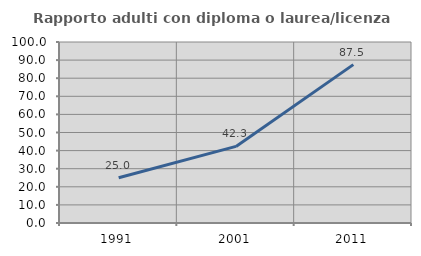
| Category | Rapporto adulti con diploma o laurea/licenza media  |
|---|---|
| 1991.0 | 25 |
| 2001.0 | 42.308 |
| 2011.0 | 87.5 |